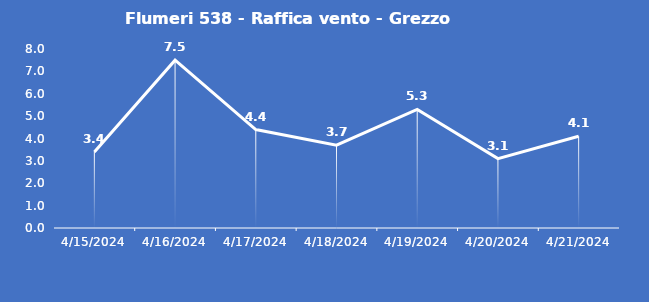
| Category | Flumeri 538 - Raffica vento - Grezzo (m/s) |
|---|---|
| 4/15/24 | 3.4 |
| 4/16/24 | 7.5 |
| 4/17/24 | 4.4 |
| 4/18/24 | 3.7 |
| 4/19/24 | 5.3 |
| 4/20/24 | 3.1 |
| 4/21/24 | 4.1 |